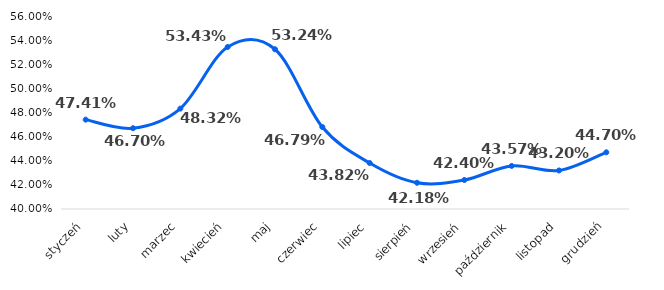
| Category | 2020 |
|---|---|
| styczeń | 0.474 |
| luty | 0.467 |
| marzec | 0.483 |
| kwiecień | 0.534 |
| maj | 0.532 |
| czerwiec | 0.468 |
| lipiec | 0.438 |
| sierpień | 0.422 |
| wrzesień | 0.424 |
| październik | 0.436 |
| listopad | 0.432 |
| grudzień | 0.447 |